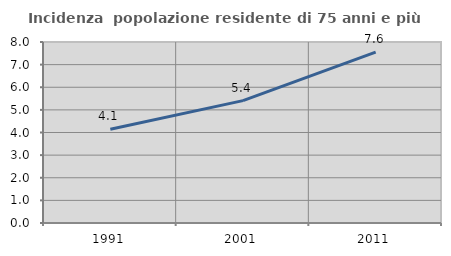
| Category | Incidenza  popolazione residente di 75 anni e più |
|---|---|
| 1991.0 | 4.144 |
| 2001.0 | 5.409 |
| 2011.0 | 7.555 |